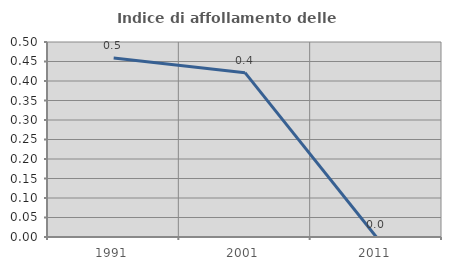
| Category | Indice di affollamento delle abitazioni  |
|---|---|
| 1991.0 | 0.459 |
| 2001.0 | 0.421 |
| 2011.0 | 0 |